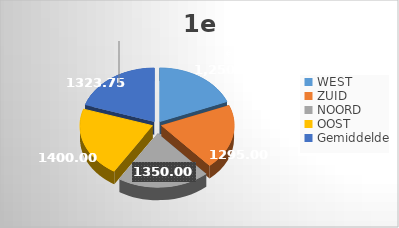
| Category | 1e Kwartaal |
|---|---|
| WEST | 1250 |
| ZUID | 1295 |
| NOORD | 1350 |
| OOST | 1400 |
| Gemiddelde | 1323.75 |